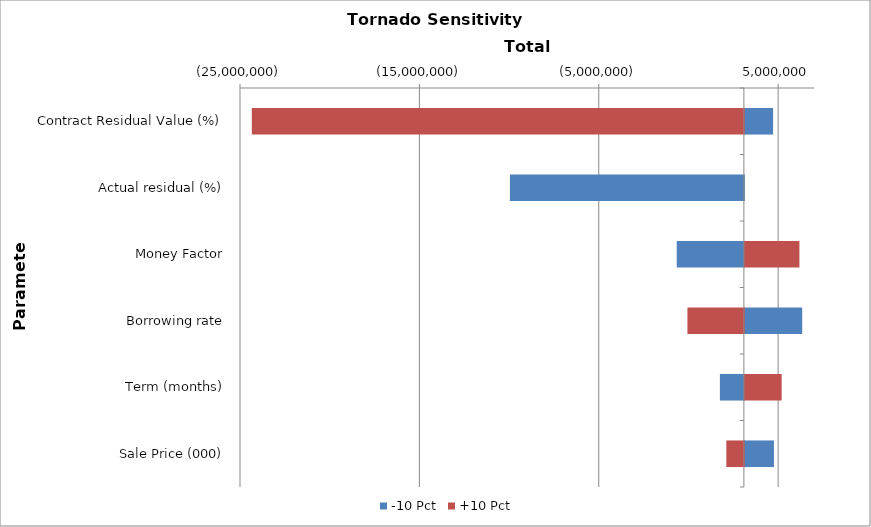
| Category | -10 Pct | +10 Pct |
|---|---|---|
| Contract Residual Value (%) | 4664195.499 | -24340922.758 |
| Actual residual (%) | -9952176.873 | 3090838.887 |
| Money Factor | -652923.4 | 6131960.754 |
| Borrowing rate | 6286919.268 | -56166.237 |
| Term (months) | 1753528.176 | 5141168.05 |
| Sale Price (000) | 4710926.515 | 2111084.548 |